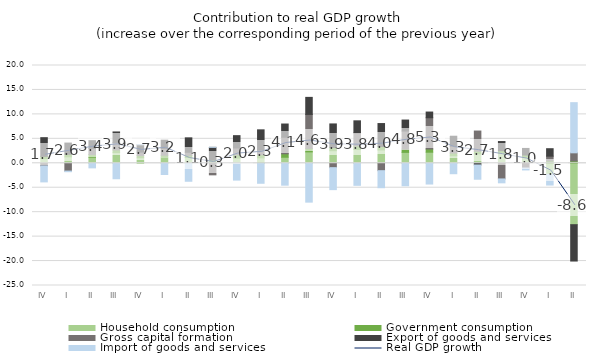
| Category | Household consumption | Government consumption | Gross capital formation | Export of goods and services | Import of goods and services |
|---|---|---|---|---|---|
| IV | 0.942 | 0.469 | -0.534 | 3.827 | -3.274 |
| I | 1.316 | 0.527 | -1.596 | 2.289 | -0.131 |
| II | 1.246 | 0.551 | 1.228 | 1.605 | -0.938 |
| III | 2.174 | 0.558 | 1.526 | 2.151 | -3.165 |
| IV | 1.125 | 0.451 | 0.706 | 1.508 | 0.022 |
| I | 1.207 | 0.443 | 1.396 | 1.68 | -2.299 |
| II | 1.183 | 0.447 | 0.625 | 2.949 | -3.679 |
| III | 0.131 | 0.513 | -2.366 | 2.612 | 0.004 |
| IV | 1.059 | 0.664 | 1.409 | 2.519 | -3.439 |
| I | 1.105 | 0.652 | 0.951 | 4.132 | -4.091 |
| II | 1.233 | 0.706 | 3.388 | 2.705 | -4.48 |
| III | 2.331 | 0.711 | 6.952 | 3.486 | -7.949 |
| IV | 2.567 | 0.656 | -0.894 | 4.826 | -4.498 |
| I | 2.83 | 0.723 | 2.646 | 2.484 | -4.509 |
| II | 2.727 | 0.702 | -1.513 | 4.696 | -3.486 |
| III | 2.231 | 0.668 | 3.694 | 2.248 | -4.602 |
| IV | 2.263 | 0.654 | 6.401 | 1.162 | -4.246 |
| I | 1.528 | 0.553 | 1.425 | 1.994 | -2.135 |
| II | 1.937 | 0.521 | 4.135 | -0.348 | -2.915 |
| III | 2.06 | 0.502 | -3.202 | 1.886 | -0.796 |
| IV | 1.207 | 0.473 | -0.973 | 1.357 | -0.391 |
| I | -2.276 | 0.487 | 0.971 | 1.523 | -2.175 |
| II | -12.561 | 0.462 | 1.676 | -7.435 | 10.259 |